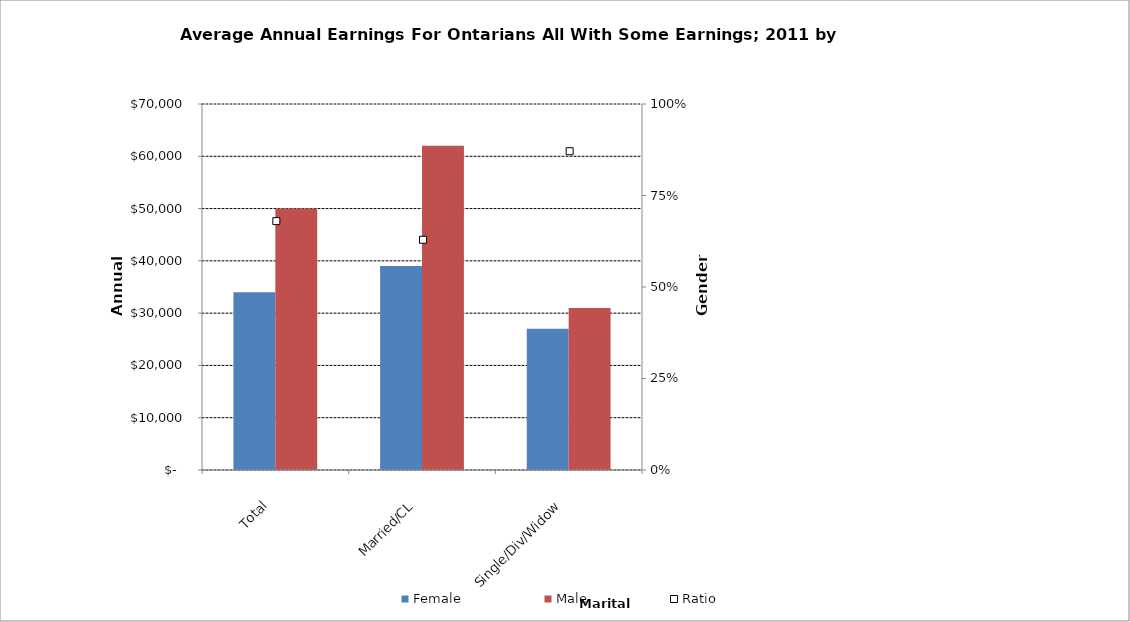
| Category | Female | Male |
|---|---|---|
| Total | 34000 | 50000 |
|  Married/CL  | 39000 | 62000 |
|  Single/Div/Widow  | 27000 | 31000 |